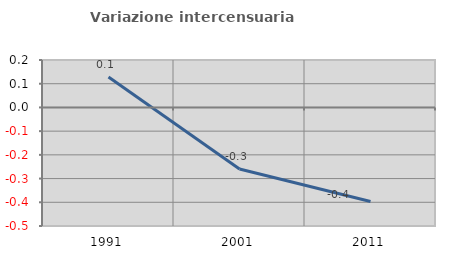
| Category | Variazione intercensuaria annua |
|---|---|
| 1991.0 | 0.128 |
| 2001.0 | -0.26 |
| 2011.0 | -0.397 |